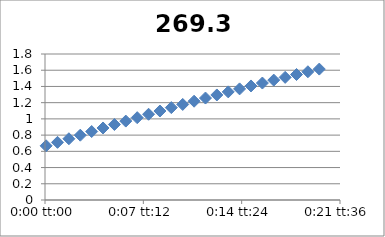
| Category | 269.3 |
|---|---|
| 5.78703703703704e-05 | 0.668 |
| 0.000636574074074074 | 0.711 |
| 0.00121527777777778 | 0.755 |
| 0.00179398148148148 | 0.799 |
| 0.00237268518518518 | 0.844 |
| 0.00295138888888889 | 0.888 |
| 0.00353009259259259 | 0.931 |
| 0.0041087962962963 | 0.973 |
| 0.0046875 | 1.015 |
| 0.0052662037037037 | 1.057 |
| 0.00584490740740741 | 1.097 |
| 0.00642361111111111 | 1.139 |
| 0.00700231481481481 | 1.178 |
| 0.00758101851851852 | 1.218 |
| 0.00815972222222222 | 1.257 |
| 0.00873842592592592 | 1.295 |
| 0.00931712962962963 | 1.333 |
| 0.00989583333333333 | 1.37 |
| 0.010474537037037 | 1.406 |
| 0.0110532407407407 | 1.442 |
| 0.0116319444444444 | 1.478 |
| 0.0122106481481481 | 1.512 |
| 0.0127893518518518 | 1.547 |
| 0.0133680555555556 | 1.581 |
| 0.0139467592592593 | 1.614 |